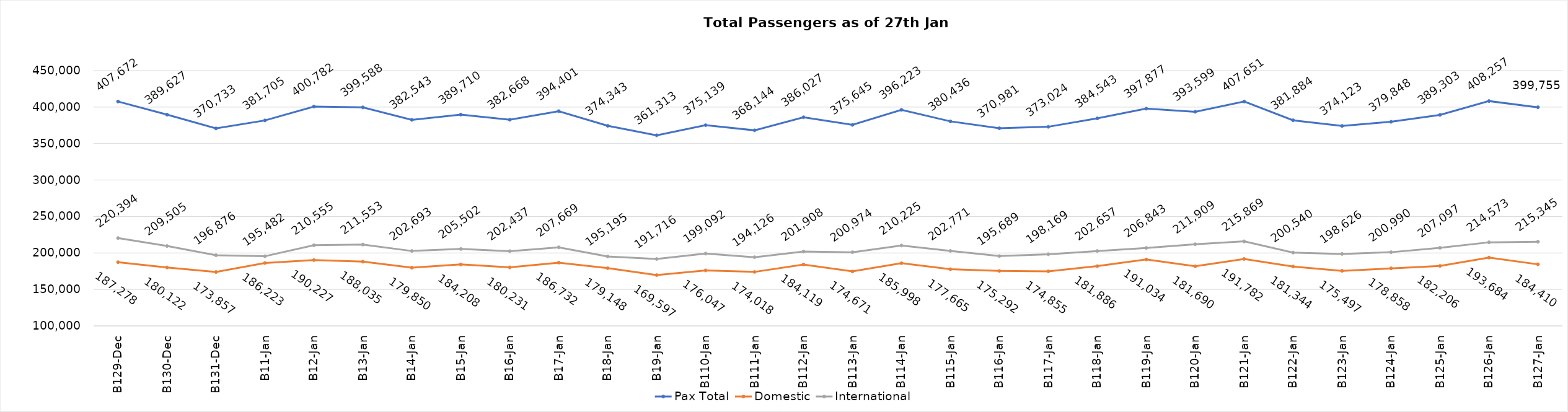
| Category | Pax Total | Domestic | International |
|---|---|---|---|
| 2023-12-29 | 407672 | 187278 | 220394 |
| 2023-12-30 | 389627 | 180122 | 209505 |
| 2023-12-31 | 370733 | 173857 | 196876 |
| 2024-01-01 | 381705 | 186223 | 195482 |
| 2024-01-02 | 400782 | 190227 | 210555 |
| 2024-01-03 | 399588 | 188035 | 211553 |
| 2024-01-04 | 382543 | 179850 | 202693 |
| 2024-01-05 | 389710 | 184208 | 205502 |
| 2024-01-06 | 382668 | 180231 | 202437 |
| 2024-01-07 | 394401 | 186732 | 207669 |
| 2024-01-08 | 374343 | 179148 | 195195 |
| 2024-01-09 | 361313 | 169597 | 191716 |
| 2024-01-10 | 375139 | 176047 | 199092 |
| 2024-01-11 | 368144 | 174018 | 194126 |
| 2024-01-12 | 386027 | 184119 | 201908 |
| 2024-01-13 | 375645 | 174671 | 200974 |
| 2024-01-14 | 396223 | 185998 | 210225 |
| 2024-01-15 | 380436 | 177665 | 202771 |
| 2024-01-16 | 370981 | 175292 | 195689 |
| 2024-01-17 | 373024 | 174855 | 198169 |
| 2024-01-18 | 384543 | 181886 | 202657 |
| 2024-01-19 | 397877 | 191034 | 206843 |
| 2024-01-20 | 393599 | 181690 | 211909 |
| 2024-01-21 | 407651 | 191782 | 215869 |
| 2024-01-22 | 381884 | 181344 | 200540 |
| 2024-01-23 | 374123 | 175497 | 198626 |
| 2024-01-24 | 379848 | 178858 | 200990 |
| 2024-01-25 | 389303 | 182206 | 207097 |
| 2024-01-26 | 408257 | 193684 | 214573 |
| 2024-01-27 | 399755 | 184410 | 215345 |